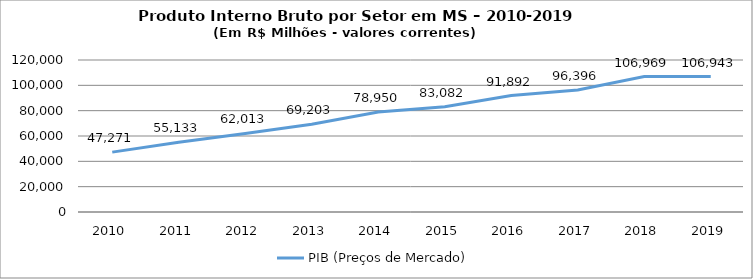
| Category | PIB (Preços de Mercado) |
|---|---|
| 2010.0 | 47270.65 |
| 2011.0 | 55133.16 |
| 2012.0 | 62013.2 |
| 2013.0 | 69203.2 |
| 2014.0 | 78950.13 |
| 2015.0 | 83082.34 |
| 2016.0 | 91892.285 |
| 2017.0 | 96396.43 |
| 2018.0 | 106969.14 |
| 2019.0 | 106943.25 |